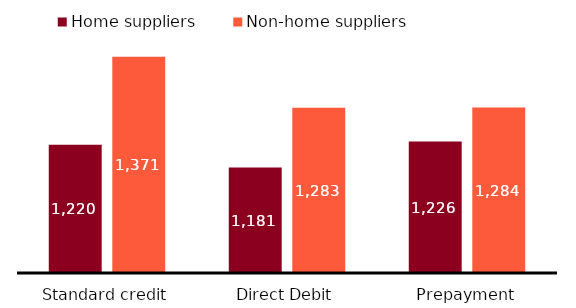
| Category | Home suppliers | Non-home suppliers |
|---|---|---|
| Standard credit | 1220.278 | 1371.147 |
| Direct Debit | 1181.223 | 1283.488 |
| Prepayment | 1225.627 | 1284.058 |